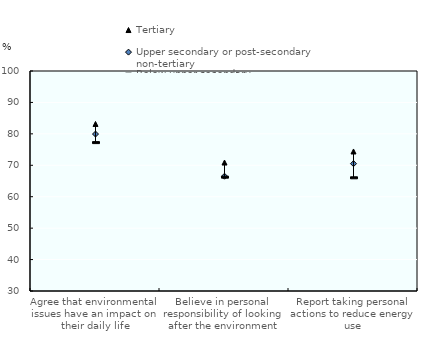
| Category | Tertiary | Upper secondary or post-secondary non-tertiary | Below upper secondary |
|---|---|---|---|
| Agree that environmental issues have an impact on their daily life | 83.152 | 79.944 | 77.22 |
| Believe in personal responsibility of looking after the environment | 70.876 | 66.512 | 66.214 |
| Report taking personal actions to reduce energy use | 74.396 | 70.51 | 66.024 |